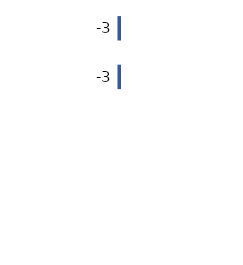
| Category | Series 0 |
|---|---|
| 0 | -3 |
| 1 | -3 |
| 2 | 0 |
| 3 | 0 |
| 4 | 0 |